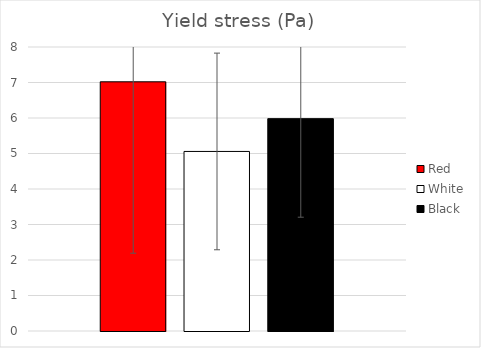
| Category | Red | White | Black |
|---|---|---|---|
| 0 | 7.02 | 5.058 | 5.981 |